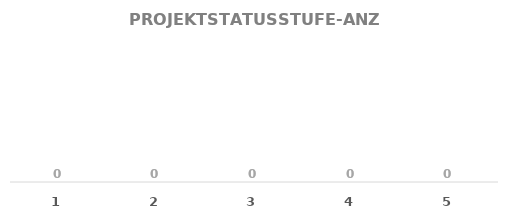
| Category | MENGE |
|---|---|
| 1.0 | 0 |
| 2.0 | 0 |
| 3.0 | 0 |
| 4.0 | 0 |
| 5.0 | 0 |